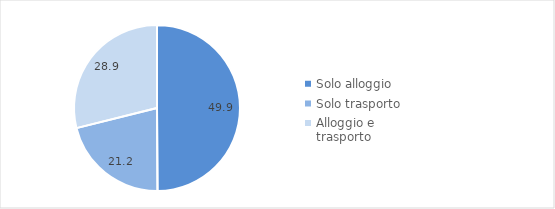
| Category | Viaggi prenotati tramite internet |
|---|---|
| Solo alloggio | 49.9 |
| Solo trasporto | 21.2 |
| Alloggio e trasporto | 28.9 |